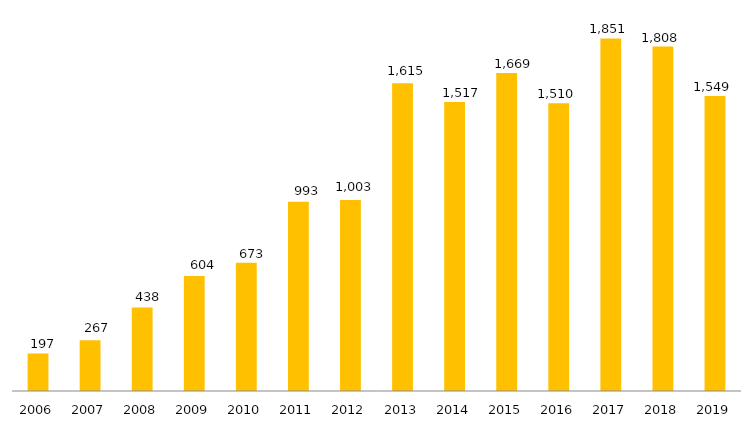
| Category | Pós - Graduação UFGD |
|---|---|
| 2006.0 | 197 |
| 2007.0 | 267 |
| 2008.0 | 438 |
| 2009.0 | 604 |
| 2010.0 | 673 |
| 2011.0 | 993 |
| 2012.0 | 1003 |
| 2013.0 | 1615 |
| 2014.0 | 1517 |
| 2015.0 | 1669 |
| 2016.0 | 1510 |
| 2017.0 | 1851 |
| 2018.0 | 1808 |
| 2019.0 | 1549 |